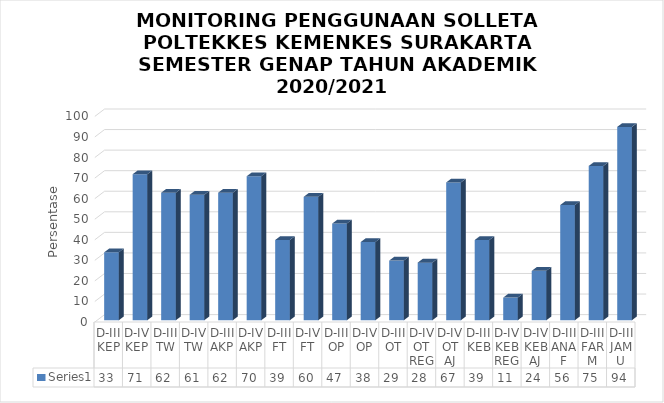
| Category | Series 0 |
|---|---|
| D-III KEP | 33 |
| D-IV KEP | 71 |
| D-III TW | 62 |
| D-IV TW | 61 |
| D-III AKP | 62 |
| D-IV AKP | 70 |
| D-III FT | 39 |
| D-IV FT | 60 |
| D-III OP | 47 |
| D-IV OP | 38 |
| D-III OT | 29 |
| D-IV OT REG | 28 |
| D-IV OT AJ | 67 |
| D-III KEB | 39 |
| D-IV KEB REG | 11 |
| D-IV KEB AJ | 24 |
| D-III ANAF | 56 |
| D-III FARM | 75 |
| D-III JAMU | 94 |